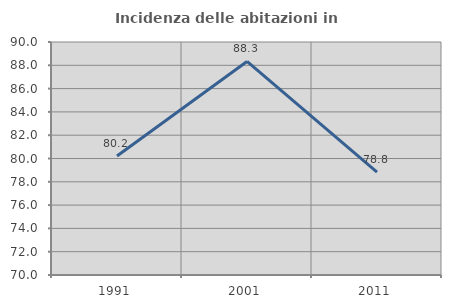
| Category | Incidenza delle abitazioni in proprietà  |
|---|---|
| 1991.0 | 80.22 |
| 2001.0 | 88.333 |
| 2011.0 | 78.824 |